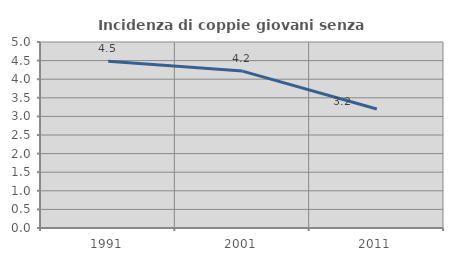
| Category | Incidenza di coppie giovani senza figli |
|---|---|
| 1991.0 | 4.484 |
| 2001.0 | 4.218 |
| 2011.0 | 3.199 |